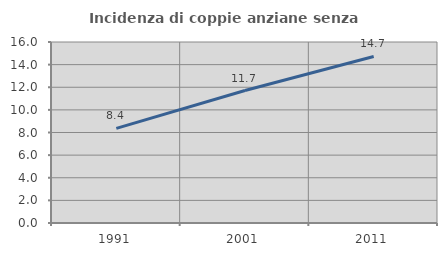
| Category | Incidenza di coppie anziane senza figli  |
|---|---|
| 1991.0 | 8.361 |
| 2001.0 | 11.71 |
| 2011.0 | 14.724 |